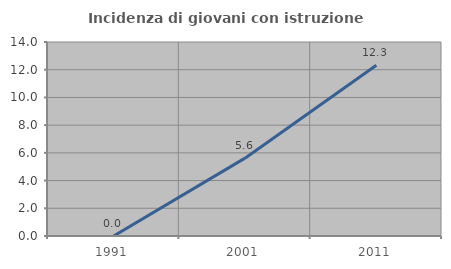
| Category | Incidenza di giovani con istruzione universitaria |
|---|---|
| 1991.0 | 0 |
| 2001.0 | 5.618 |
| 2011.0 | 12.329 |